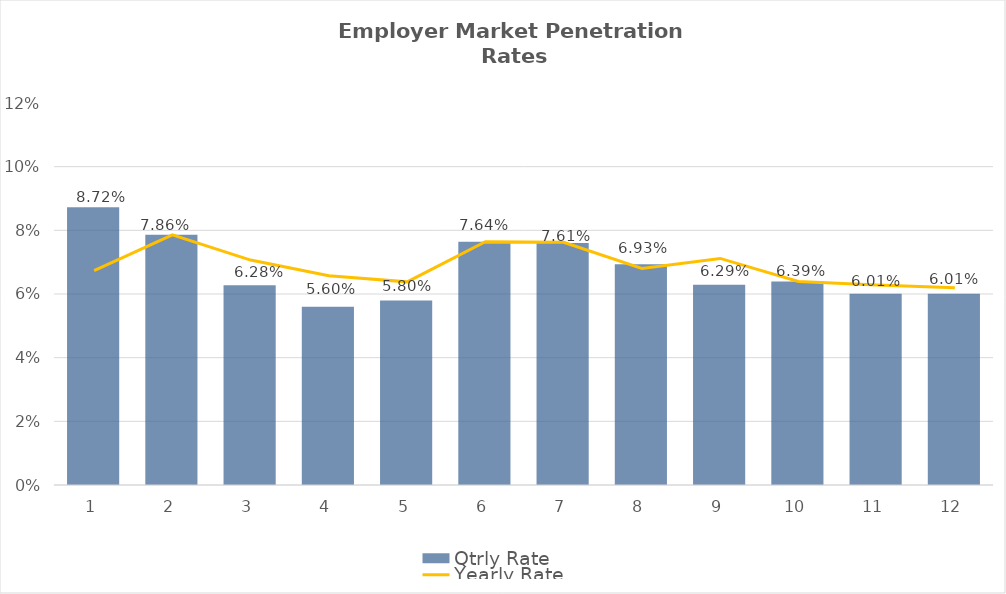
| Category | Qtrly Rate |
|---|---|
| 0 | 0.087 |
| 1 | 0.079 |
| 2 | 0.063 |
| 3 | 0.056 |
| 4 | 0.058 |
| 5 | 0.076 |
| 6 | 0.076 |
| 7 | 0.069 |
| 8 | 0.063 |
| 9 | 0.064 |
| 10 | 0.06 |
| 11 | 0.06 |